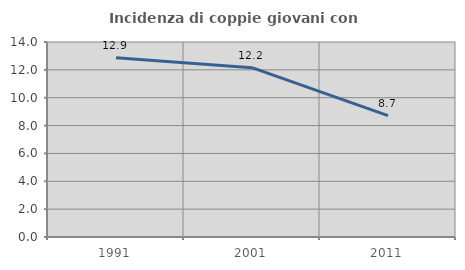
| Category | Incidenza di coppie giovani con figli |
|---|---|
| 1991.0 | 12.863 |
| 2001.0 | 12.157 |
| 2011.0 | 8.711 |